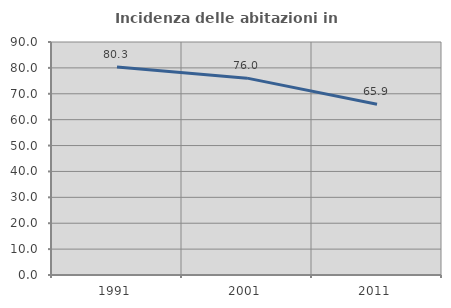
| Category | Incidenza delle abitazioni in proprietà  |
|---|---|
| 1991.0 | 80.347 |
| 2001.0 | 76.036 |
| 2011.0 | 65.93 |